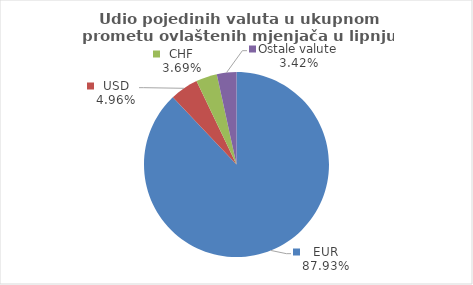
| Category | Series 0 |
|---|---|
| EUR | 87.925 |
| USD | 4.958 |
| CHF | 3.693 |
| Ostale valute | 3.424 |